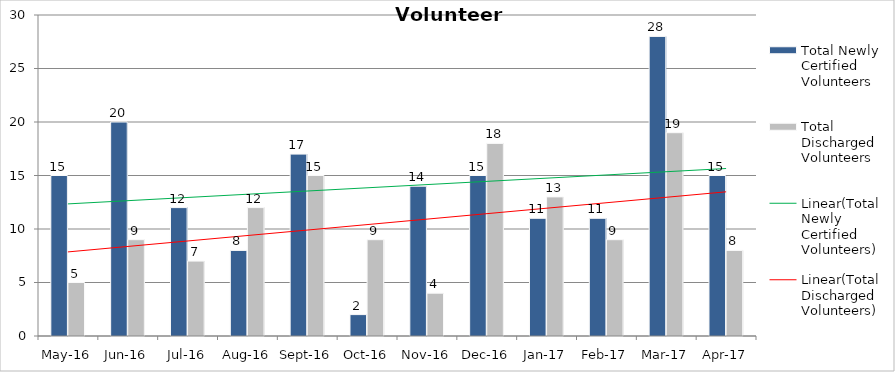
| Category | Total Newly Certified Volunteers | Total Discharged Volunteers |
|---|---|---|
| May-16 | 15 | 5 |
| Jun-16 | 20 | 9 |
| Jul-16 | 12 | 7 |
| Aug-16 | 8 | 12 |
| Sep-16 | 17 | 15 |
| Oct-16 | 2 | 9 |
| Nov-16 | 14 | 4 |
| Dec-16 | 15 | 18 |
| Jan-17 | 11 | 13 |
| Feb-17 | 11 | 9 |
| Mar-17 | 28 | 19 |
| Apr-17 | 15 | 8 |